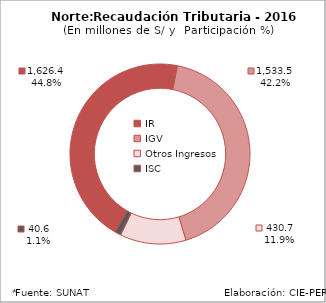
| Category | 2016 |
|---|---|
| IR | 1626.424 |
| IGV | 1533.497 |
| Otros Ingresos | 430.689 |
| ISC | 40.637 |